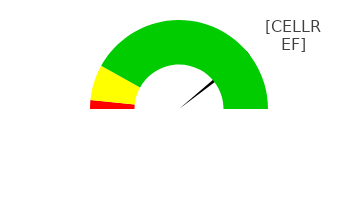
| Category | pointer |
|---|---|
| 0 | 77.419 |
| 1 | 2 |
| 2 | 120.581 |